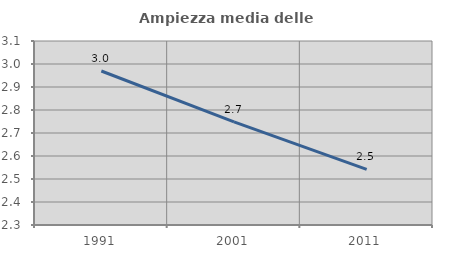
| Category | Ampiezza media delle famiglie |
|---|---|
| 1991.0 | 2.97 |
| 2001.0 | 2.749 |
| 2011.0 | 2.542 |